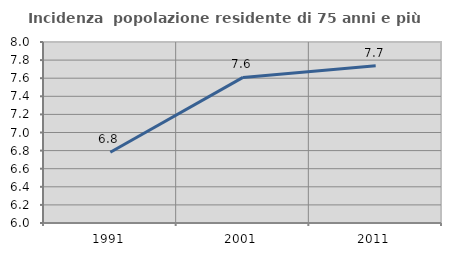
| Category | Incidenza  popolazione residente di 75 anni e più |
|---|---|
| 1991.0 | 6.782 |
| 2001.0 | 7.609 |
| 2011.0 | 7.737 |